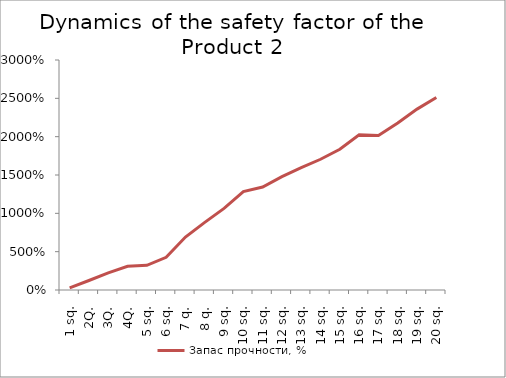
| Category | Запас прочности, % |
|---|---|
| 1 sq. | 0.28 |
| 2Q. | 1.236 |
| 3Q. | 2.224 |
| 4Q. | 3.093 |
| 5 sq. | 3.222 |
| 6 sq. | 4.27 |
| 7 q. | 6.912 |
| 8 q. | 8.821 |
| 9 sq. | 10.638 |
| 10 sq. | 12.829 |
| 11 sq. | 13.437 |
| 12 sq. | 14.777 |
| 13 sq. | 15.95 |
| 14 sq. | 17.052 |
| 15 sq. | 18.352 |
| 16 sq. | 20.233 |
| 17 sq. | 20.156 |
| 18 sq. | 21.787 |
| 19 sq. | 23.594 |
| 20 sq. | 25.103 |